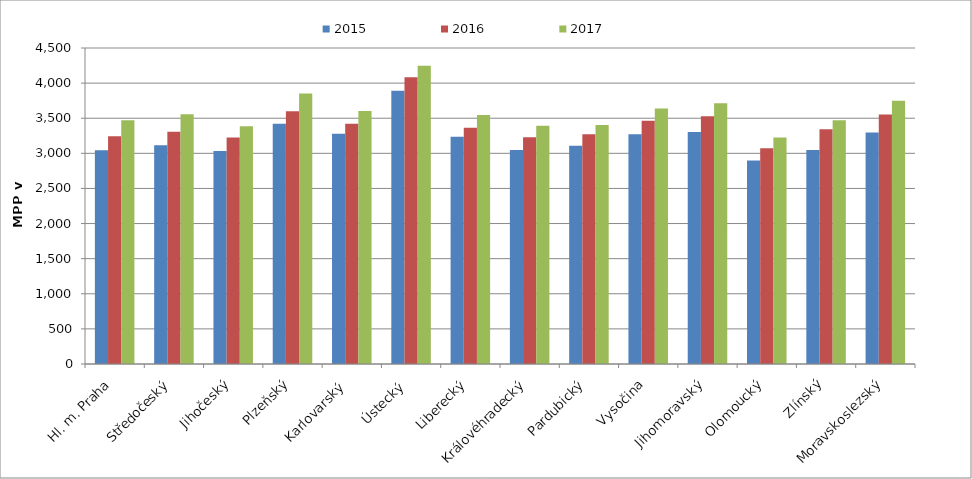
| Category | 2015 | 2016 | 2017 |
|---|---|---|---|
| Hl. m. Praha | 3044.088 | 3243.362 | 3470.352 |
| Středočeský | 3114.722 | 3307.108 | 3557.624 |
| Jihočeský | 3033.368 | 3224.501 | 3385.35 |
| Plzeňský | 3422.45 | 3598.929 | 3850.926 |
| Karlovarský  | 3279.321 | 3421.9 | 3603.364 |
| Ústecký   | 3890.68 | 4085.243 | 4248.641 |
| Liberecký | 3237.167 | 3363.139 | 3547.605 |
| Královéhradecký | 3047.786 | 3230.769 | 3392.308 |
| Pardubický | 3106.619 | 3272.91 | 3403.927 |
| Vysočina | 3271.533 | 3463.807 | 3639.794 |
| Jihomoravský | 3303.805 | 3526.555 | 3714.516 |
| Olomoucký | 2898.006 | 3071.909 | 3225.527 |
| Zlínský | 3047.332 | 3341.865 | 3471.826 |
| Moravskoslezský | 3297.47 | 3553.128 | 3748.785 |